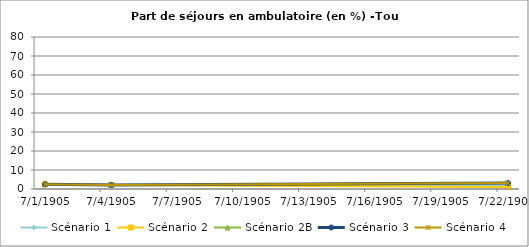
| Category | Scénario 1 | Scénario 2 | Scénario 2B | Scénario 3 | Scénario 4 |
|---|---|---|---|---|---|
| 2009.0 | 2.5 | 2.5 | 2.5 | 2.5 | 2.5 |
| 2012.0 | 2.148 | 2.148 | 2.148 | 2.148 | 2.148 |
| 2030.0 | 2.001 | 1.101 | 3.143 | 3.143 | 3.143 |